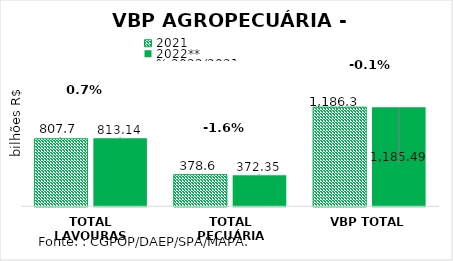
| Category | 2021 | 2022** |
|---|---|---|
| TOTAL LAVOURAS | 807.733 | 813.135 |
| TOTAL PECUÁRIA | 378.555 | 372.353 |
| VBP TOTAL | 1186.289 | 1185.488 |